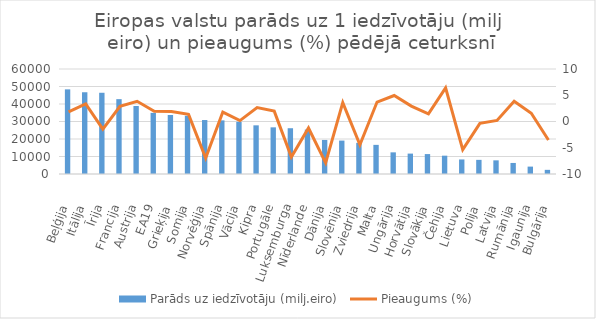
| Category | Parāds uz iedzīvotāju (milj.eiro) |
|---|---|
|  Beļģija | 48364.321 |
| Itālija | 46714.891 |
| Īrija | 46419.243 |
| Francija | 42773.225 |
|  Austrija | 38841.503 |
| EA19 | 34927.699 |
| Grieķija | 33729.857 |
| Somija | 33276.492 |
| Norvēģija | 30839.59 |
| Spānija | 30650.791 |
| Vācija | 29824.625 |
| Kipra | 27808.402 |
| Portugāle | 26660.943 |
| Luksemburga | 26154.444 |
| Nīderlande | 25378.166 |
| Dānija | 19454.56 |
| Slovēnija | 19089.304 |
| Zviedrija | 17796.479 |
| Malta | 16646.224 |
| Ungārija | 12373.297 |
| Horvātija | 11658.71 |
| Slovākija | 11384.982 |
|  Čehija | 10468.305 |
| Lietuva | 8306.492 |
| Polija | 8080.509 |
| Latvija | 7800.851 |
| Rumānija | 6308.729 |
| Igaunija | 4226.849 |
|  Bulgārija | 2373.264 |